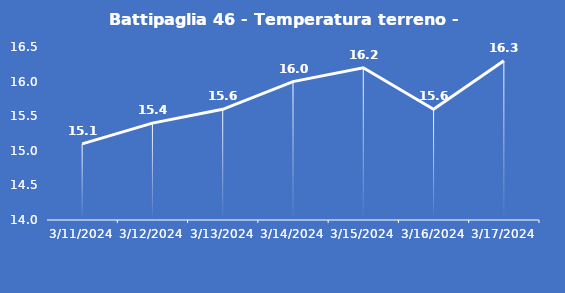
| Category | Battipaglia 46 - Temperatura terreno - Max (°C) |
|---|---|
| 3/11/24 | 15.1 |
| 3/12/24 | 15.4 |
| 3/13/24 | 15.6 |
| 3/14/24 | 16 |
| 3/15/24 | 16.2 |
| 3/16/24 | 15.6 |
| 3/17/24 | 16.3 |